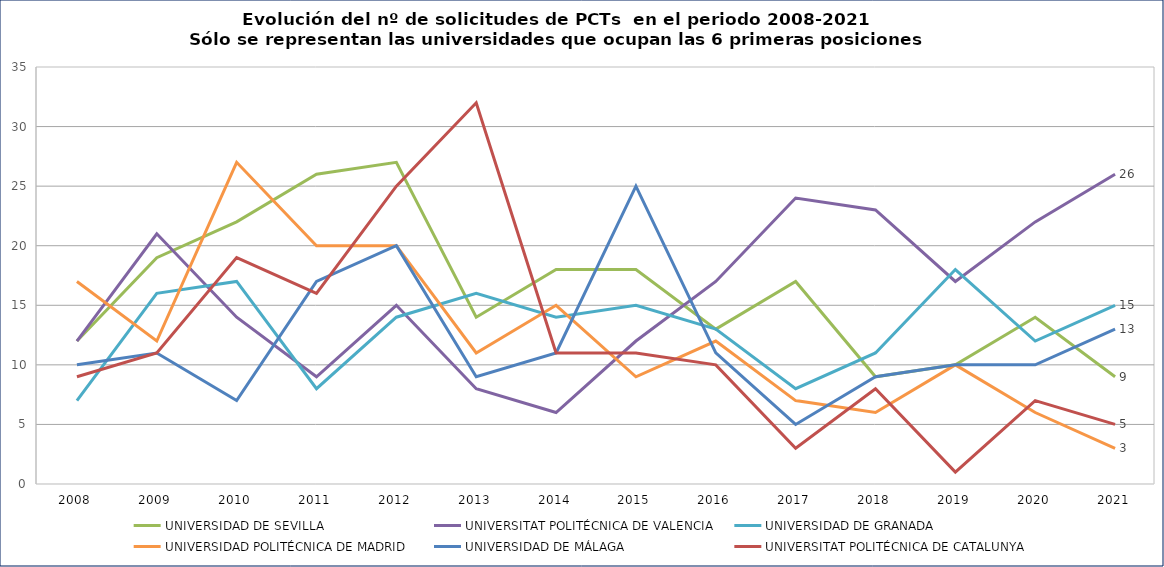
| Category | UNIVERSIDAD DE SEVILLA | UNIVERSITAT POLITÉCNICA DE VALENCIA | UNIVERSIDAD DE GRANADA | UNIVERSIDAD POLITÉCNICA DE MADRID | UNIVERSIDAD DE MÁLAGA | UNIVERSITAT POLITÉCNICA DE CATALUNYA |
|---|---|---|---|---|---|---|
| 2008 | 12 | 12 | 7 | 17 | 10 | 9 |
| 2009 | 19 | 21 | 16 | 12 | 11 | 11 |
| 2010 | 22 | 14 | 17 | 27 | 7 | 19 |
| 2011 | 26 | 9 | 8 | 20 | 17 | 16 |
| 2012 | 27 | 15 | 14 | 20 | 20 | 25 |
| 2013 | 14 | 8 | 16 | 11 | 9 | 32 |
| 2014 | 18 | 6 | 14 | 15 | 11 | 11 |
| 2015 | 18 | 12 | 15 | 9 | 25 | 11 |
| 2016 | 13 | 17 | 13 | 12 | 11 | 10 |
| 2017 | 17 | 24 | 8 | 7 | 5 | 3 |
| 2018 | 9 | 23 | 11 | 6 | 9 | 8 |
| 2019 | 10 | 17 | 18 | 10 | 10 | 1 |
| 2020 | 14 | 22 | 12 | 6 | 10 | 7 |
| 2021 | 9 | 26 | 15 | 3 | 13 | 5 |